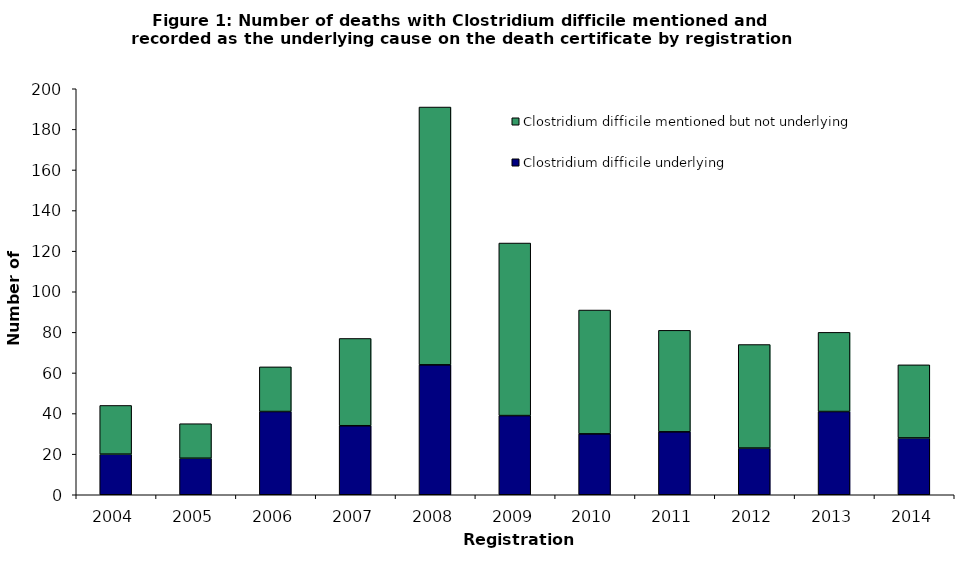
| Category | Clostridium difficile underlying | Clostridium difficile mentioned but not underlying |
|---|---|---|
| 2004.0 | 20 | 24 |
| 2005.0 | 18 | 17 |
| 2006.0 | 41 | 22 |
| 2007.0 | 34 | 43 |
| 2008.0 | 64 | 127 |
| 2009.0 | 39 | 85 |
| 2010.0 | 30 | 61 |
| 2011.0 | 31 | 50 |
| 2012.0 | 23 | 51 |
| 2013.0 | 41 | 39 |
| 2014.0 | 28 | 36 |